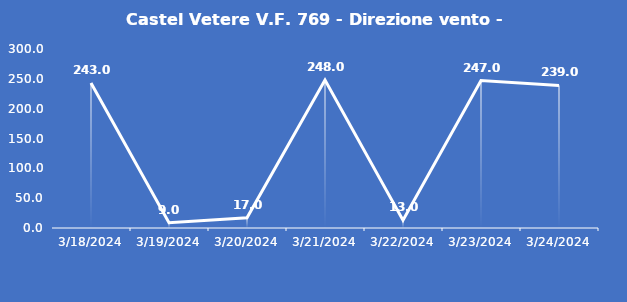
| Category | Castel Vetere V.F. 769 - Direzione vento - Grezzo (°N) |
|---|---|
| 3/18/24 | 243 |
| 3/19/24 | 9 |
| 3/20/24 | 17 |
| 3/21/24 | 248 |
| 3/22/24 | 13 |
| 3/23/24 | 247 |
| 3/24/24 | 239 |